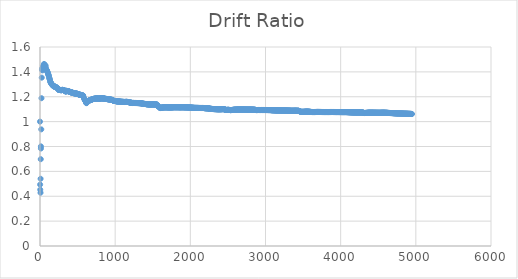
| Category | Drift Ratio |
|---|---|
| 0.0 | 1 |
| 1.70000004768 | 0.494 |
| 3.40000009537 | 0.453 |
| 7.0 | 0.428 |
| 8.0 | 0.541 |
| 10.0 | 0.698 |
| 12.0 | 0.801 |
| 12.5999999046 | 0.784 |
| 17.0 | 0.938 |
| 19.7999999523 | 1.188 |
| 23.4000000954 | 1.353 |
| 26.5999999046 | 1.417 |
| 30.0 | 1.429 |
| 33.0999999046 | 1.412 |
| 36.2999999523 | 1.432 |
| 39.5999999046 | 1.432 |
| 42.4000000954 | 1.444 |
| 45.5999999046 | 1.451 |
| 48.5999999046 | 1.433 |
| 51.5999999046 | 1.428 |
| 54.4000000954 | 1.464 |
| 57.5999999046 | 1.457 |
| 60.5999999046 | 1.454 |
| 64.0 | 1.445 |
| 67.4000000954 | 1.42 |
| 72.0999999046 | 1.454 |
| 75.5999999046 | 1.442 |
| 79.2000000477 | 1.427 |
| 82.4000000954 | 1.422 |
| 85.5999999046 | 1.415 |
| 89.0 | 1.413 |
| 92.2000000477 | 1.412 |
| 95.5999999046 | 1.405 |
| 99.0 | 1.4 |
| 102.0 | 1.396 |
| 105.400000095 | 1.389 |
| 108.799999952 | 1.381 |
| 112.0 | 1.377 |
| 115.599999905 | 1.371 |
| 119.0 | 1.366 |
| 123.099999905 | 1.35 |
| 126.0 | 1.348 |
| 129.200000048 | 1.341 |
| 132.599999905 | 1.334 |
| 135.799999952 | 1.323 |
| 139.0 | 1.319 |
| 142.400000095 | 1.314 |
| 145.799999952 | 1.312 |
| 149.200000048 | 1.307 |
| 153.099999905 | 1.304 |
| 156.200000048 | 1.3 |
| 159.599999905 | 1.298 |
| 163.0 | 1.294 |
| 166.200000048 | 1.294 |
| 169.400000095 | 1.294 |
| 172.799999952 | 1.289 |
| 176.400000095 | 1.286 |
| 180.0 | 1.285 |
| 183.200000048 | 1.284 |
| 186.599999905 | 1.283 |
| 190.0 | 1.282 |
| 193.400000095 | 1.283 |
| 196.799999952 | 1.281 |
| 200.200000048 | 1.281 |
| 203.599999905 | 1.281 |
| 207.200000048 | 1.28 |
| 210.599999905 | 1.278 |
| 214.200000048 | 1.276 |
| 217.599999905 | 1.275 |
| 221.0 | 1.274 |
| 224.400000095 | 1.271 |
| 228.099999905 | 1.271 |
| 231.299999952 | 1.27 |
| 234.799999952 | 1.269 |
| 238.400000095 | 1.266 |
| 242.0 | 1.263 |
| 245.400000095 | 1.256 |
| 249.099999905 | 1.255 |
| 252.299999952 | 1.256 |
| 255.799999952 | 1.255 |
| 259.400000095 | 1.254 |
| 262.799999952 | 1.255 |
| 266.200000048 | 1.255 |
| 269.599999905 | 1.255 |
| 273.099999905 | 1.254 |
| 276.599999905 | 1.253 |
| 280.0 | 1.252 |
| 283.400000095 | 1.252 |
| 286.599999905 | 1.253 |
| 290.0 | 1.254 |
| 293.200000048 | 1.255 |
| 296.400000095 | 1.256 |
| 300.099999905 | 1.256 |
| 303.200000048 | 1.255 |
| 306.400000095 | 1.254 |
| 309.799999952 | 1.254 |
| 313.200000048 | 1.253 |
| 316.599999905 | 1.252 |
| 319.799999952 | 1.251 |
| 323.200000048 | 1.251 |
| 326.400000095 | 1.25 |
| 330.099999905 | 1.25 |
| 333.299999952 | 1.248 |
| 336.799999952 | 1.244 |
| 340.200000048 | 1.243 |
| 343.799999952 | 1.243 |
| 343.799999952 | 1.243 |
| 343.799999952 | 1.243 |
| 349.400000095 | 1.247 |
| 352.599999905 | 1.248 |
| 355.799999952 | 1.247 |
| 358.799999952 | 1.247 |
| 362.200000048 | 1.247 |
| 365.599999905 | 1.246 |
| 369.099999905 | 1.245 |
| 372.599999905 | 1.246 |
| 376.0 | 1.245 |
| 379.400000095 | 1.243 |
| 382.799999952 | 1.242 |
| 386.0 | 1.242 |
| 389.599999905 | 1.241 |
| 393.099999905 | 1.241 |
| 396.200000048 | 1.239 |
| 399.599999905 | 1.239 |
| 403.0 | 1.239 |
| 406.400000095 | 1.237 |
| 407.700000048 | 1.237 |
| 409.0 | 1.236 |
| 410.200000048 | 1.237 |
| 413.599999905 | 1.236 |
| 417.099999905 | 1.234 |
| 420.099999905 | 1.235 |
| 423.299999952 | 1.235 |
| 426.400000095 | 1.234 |
| 429.599999905 | 1.233 |
| 433.0 | 1.232 |
| 436.200000048 | 1.231 |
| 439.400000095 | 1.231 |
| 442.799999952 | 1.23 |
| 446.200000048 | 1.23 |
| 449.599999905 | 1.228 |
| 453.099999905 | 1.228 |
| 456.299999952 | 1.227 |
| 459.599999905 | 1.227 |
| 462.799999952 | 1.227 |
| 466.299999952 | 1.227 |
| 469.400000095 | 1.227 |
| 472.799999952 | 1.227 |
| 476.0 | 1.226 |
| 479.299999952 | 1.226 |
| 482.599999905 | 1.225 |
| 486.099999905 | 1.225 |
| 489.200000048 | 1.224 |
| 492.400000095 | 1.224 |
| 495.799999952 | 1.224 |
| 499.099999905 | 1.223 |
| 502.400000095 | 1.222 |
| 505.700000048 | 1.222 |
| 509.0 | 1.221 |
| 512.5 | 1.22 |
| 515.599999905 | 1.219 |
| 519.099999905 | 1.218 |
| 522.200000048 | 1.217 |
| 525.599999905 | 1.216 |
| 528.799999952 | 1.216 |
| 532.099999905 | 1.216 |
| 535.200000048 | 1.216 |
| 538.5 | 1.216 |
| 541.599999905 | 1.215 |
| 544.900000095 | 1.215 |
| 548.0 | 1.214 |
| 551.5 | 1.214 |
| 554.599999905 | 1.213 |
| 558.099999905 | 1.212 |
| 558.099999905 | 1.212 |
| 558.099999905 | 1.212 |
| 572.599999905 | 1.21 |
| 572.599999905 | 1.21 |
| 572.599999905 | 1.21 |
| 579.200000048 | 1.199 |
| 585.200000048 | 1.189 |
| 589.0 | 1.184 |
| 591.0 | 1.181 |
| 594.400000095 | 1.177 |
| 596.700000048 | 1.174 |
| 600.599999905 | 1.17 |
| 602.599999905 | 1.168 |
| 604.200000048 | 1.166 |
| 611.0 | 1.156 |
| 612.0 | 1.155 |
| 616.650000095 | 1.148 |
| 621.299999952 | 1.151 |
| 623.099999905 | 1.153 |
| 624.900000095 | 1.155 |
| 628.099999905 | 1.157 |
| 631.299999952 | 1.16 |
| 634.900000095 | 1.161 |
| 637.900000095 | 1.163 |
| 641.0 | 1.165 |
| 644.099999905 | 1.166 |
| 647.200000048 | 1.167 |
| 650.299999952 | 1.169 |
| 653.5 | 1.17 |
| 656.700000048 | 1.171 |
| 659.900000095 | 1.171 |
| 663.099999905 | 1.172 |
| 666.099999905 | 1.172 |
| 669.099999905 | 1.173 |
| 672.099999905 | 1.174 |
| 675.299999952 | 1.175 |
| 678.299999952 | 1.176 |
| 681.5 | 1.176 |
| 684.5 | 1.177 |
| 687.700000048 | 1.177 |
| 690.700000048 | 1.178 |
| 693.700000048 | 1.179 |
| 696.900000095 | 1.18 |
| 700.099999905 | 1.181 |
| 703.099999905 | 1.181 |
| 706.299999952 | 1.181 |
| 709.299999952 | 1.182 |
| 712.299999952 | 1.183 |
| 715.299999952 | 1.183 |
| 718.5 | 1.184 |
| 721.299999952 | 1.184 |
| 724.5 | 1.184 |
| 727.5 | 1.184 |
| 730.5 | 1.184 |
| 733.5 | 1.184 |
| 736.5 | 1.185 |
| 739.5 | 1.185 |
| 742.5 | 1.185 |
| 746.0 | 1.186 |
| 749.0 | 1.186 |
| 752.0 | 1.187 |
| 755.0 | 1.186 |
| 758.0 | 1.186 |
| 761.0 | 1.186 |
| 764.0 | 1.186 |
| 767.099999905 | 1.186 |
| 770.099999905 | 1.185 |
| 773.200000048 | 1.185 |
| 776.299999952 | 1.185 |
| 779.5 | 1.185 |
| 782.5 | 1.185 |
| 785.700000048 | 1.185 |
| 788.700000048 | 1.185 |
| 791.700000048 | 1.185 |
| 794.700000048 | 1.185 |
| 797.700000048 | 1.185 |
| 800.5 | 1.185 |
| 803.5 | 1.185 |
| 806.299999952 | 1.186 |
| 809.0 | 1.187 |
| 812.0 | 1.188 |
| 815.0 | 1.188 |
| 818.0 | 1.188 |
| 821.0 | 1.188 |
| 824.099999905 | 1.187 |
| 827.099999905 | 1.187 |
| 830.299999952 | 1.187 |
| 833.299999952 | 1.187 |
| 836.5 | 1.186 |
| 839.5 | 1.186 |
| 842.700000048 | 1.186 |
| 845.900000095 | 1.186 |
| 849.099999905 | 1.186 |
| 852.299999952 | 1.186 |
| 855.299999952 | 1.186 |
| 858.5 | 1.185 |
| 861.700000048 | 1.184 |
| 864.900000095 | 1.184 |
| 868.099999905 | 1.183 |
| 871.299999952 | 1.182 |
| 874.5 | 1.182 |
| 878.0 | 1.183 |
| 881.0 | 1.183 |
| 884.099999905 | 1.182 |
| 887.299999952 | 1.182 |
| 890.5 | 1.182 |
| 893.900000095 | 1.181 |
| 896.900000095 | 1.181 |
| 900.099999905 | 1.18 |
| 903.299999952 | 1.18 |
| 906.5 | 1.18 |
| 909.700000048 | 1.18 |
| 912.700000048 | 1.179 |
| 915.900000095 | 1.179 |
| 919.099999905 | 1.179 |
| 922.299999952 | 1.179 |
| 925.5 | 1.178 |
| 929.0 | 1.178 |
| 932.0 | 1.177 |
| 935.099999905 | 1.177 |
| 938.200000048 | 1.177 |
| 941.299999952 | 1.177 |
| 944.5 | 1.176 |
| 947.700000048 | 1.176 |
| 950.900000095 | 1.176 |
| 954.099999905 | 1.175 |
| 957.299999952 | 1.175 |
| 960.700000048 | 1.175 |
| 963.900000095 | 1.174 |
| 967.299999952 | 1.172 |
| 970.299999952 | 1.17 |
| 973.299999952 | 1.17 |
| 976.5 | 1.168 |
| 980.0 | 1.168 |
| 983.200000048 | 1.167 |
| 986.5 | 1.167 |
| 989.700000048 | 1.167 |
| 992.900000095 | 1.167 |
| 996.099999905 | 1.166 |
| 999.5 | 1.166 |
| 1002.70000005 | 1.166 |
| 1005.9000001 | 1.166 |
| 1009.0999999 | 1.165 |
| 1012.5 | 1.164 |
| 1016.0 | 1.164 |
| 1019.0 | 1.163 |
| 1022.20000005 | 1.163 |
| 1025.5 | 1.163 |
| 1028.70000005 | 1.163 |
| 1031.9000001 | 1.163 |
| 1035.0999999 | 1.163 |
| 1038.29999995 | 1.163 |
| 1041.70000005 | 1.162 |
| 1044.9000001 | 1.162 |
| 1048.0999999 | 1.162 |
| 1051.29999995 | 1.162 |
| 1054.5 | 1.161 |
| 1058.0 | 1.161 |
| 1061.0 | 1.161 |
| 1064.29999995 | 1.161 |
| 1067.5 | 1.161 |
| 1070.70000005 | 1.16 |
| 1073.9000001 | 1.16 |
| 1077.0999999 | 1.16 |
| 1080.29999995 | 1.159 |
| 1083.5 | 1.16 |
| 1086.70000005 | 1.16 |
| 1089.9000001 | 1.159 |
| 1093.0999999 | 1.159 |
| 1096.29999995 | 1.159 |
| 1099.5 | 1.159 |
| 1103.0 | 1.159 |
| 1106.0 | 1.159 |
| 1109.0999999 | 1.159 |
| 1112.29999995 | 1.158 |
| 1115.5999999 | 1.158 |
| 1118.70000005 | 1.158 |
| 1121.9000001 | 1.158 |
| 1125.0999999 | 1.158 |
| 1128.4000001 | 1.158 |
| 1131.5 | 1.158 |
| 1134.79999995 | 1.158 |
| 1137.9000001 | 1.159 |
| 1141.20000005 | 1.159 |
| 1144.5 | 1.159 |
| 1148.0 | 1.159 |
| 1151.0 | 1.159 |
| 1154.0999999 | 1.159 |
| 1157.5 | 1.158 |
| 1160.79999995 | 1.158 |
| 1163.9000001 | 1.158 |
| 1167.20000005 | 1.158 |
| 1170.70000005 | 1.158 |
| 1174.20000005 | 1.157 |
| 1177.29999995 | 1.157 |
| 1181.0 | 1.157 |
| 1184.0 | 1.156 |
| 1187.29999995 | 1.156 |
| 1190.70000005 | 1.155 |
| 1193.9000001 | 1.154 |
| 1197.20000005 | 1.153 |
| 1200.4000001 | 1.152 |
| 1203.5999999 | 1.152 |
| 1206.70000005 | 1.152 |
| 1210.0 | 1.152 |
| 1213.20000005 | 1.152 |
| 1216.4000001 | 1.152 |
| 1219.5999999 | 1.151 |
| 1223.0 | 1.151 |
| 1226.0999999 | 1.15 |
| 1229.4000001 | 1.15 |
| 1232.79999995 | 1.149 |
| 1236.0 | 1.15 |
| 1239.20000005 | 1.15 |
| 1242.5999999 | 1.15 |
| 1245.79999995 | 1.15 |
| 1249.20000005 | 1.15 |
| 1252.5999999 | 1.15 |
| 1256.0 | 1.15 |
| 1259.0 | 1.15 |
| 1262.5999999 | 1.15 |
| 1266.0 | 1.15 |
| 1269.20000005 | 1.15 |
| 1272.5999999 | 1.15 |
| 1276.0 | 1.15 |
| 1279.20000005 | 1.15 |
| 1282.5 | 1.15 |
| 1285.5999999 | 1.15 |
| 1289.0 | 1.149 |
| 1292.4000001 | 1.149 |
| 1295.79999995 | 1.149 |
| 1299.0 | 1.149 |
| 1302.20000005 | 1.149 |
| 1305.4000001 | 1.149 |
| 1308.79999995 | 1.149 |
| 1312.0 | 1.149 |
| 1315.20000005 | 1.149 |
| 1318.4000001 | 1.148 |
| 1321.5999999 | 1.148 |
| 1325.0 | 1.148 |
| 1328.0 | 1.148 |
| 1331.4000001 | 1.148 |
| 1334.5999999 | 1.148 |
| 1337.79999995 | 1.148 |
| 1341.0 | 1.148 |
| 1344.4000001 | 1.147 |
| 1347.5999999 | 1.147 |
| 1350.79999995 | 1.147 |
| 1353.79999995 | 1.147 |
| 1357.20000005 | 1.146 |
| 1360.4000001 | 1.146 |
| 1364.0 | 1.144 |
| 1367.0 | 1.144 |
| 1370.0 | 1.144 |
| 1373.0999999 | 1.144 |
| 1376.4000001 | 1.144 |
| 1379.4000001 | 1.143 |
| 1382.5999999 | 1.143 |
| 1386.0 | 1.143 |
| 1389.20000005 | 1.142 |
| 1392.5999999 | 1.142 |
| 1395.5999999 | 1.142 |
| 1399.0 | 1.142 |
| 1402.20000005 | 1.142 |
| 1405.5999999 | 1.142 |
| 1409.0 | 1.141 |
| 1412.0999999 | 1.14 |
| 1415.5999999 | 1.14 |
| 1419.0 | 1.14 |
| 1422.20000005 | 1.14 |
| 1425.79999995 | 1.139 |
| 1429.0 | 1.139 |
| 1432.4000001 | 1.139 |
| 1435.5999999 | 1.139 |
| 1439.0 | 1.139 |
| 1442.4000001 | 1.139 |
| 1445.5999999 | 1.138 |
| 1448.79999995 | 1.138 |
| 1452.0 | 1.138 |
| 1455.4000001 | 1.138 |
| 1458.5999999 | 1.138 |
| 1461.79999995 | 1.138 |
| 1465.0 | 1.138 |
| 1468.4000001 | 1.138 |
| 1472.0 | 1.138 |
| 1475.0 | 1.138 |
| 1478.5999999 | 1.138 |
| 1481.79999995 | 1.138 |
| 1485.0 | 1.138 |
| 1488.4000001 | 1.139 |
| 1491.5999999 | 1.139 |
| 1494.79999995 | 1.139 |
| 1498.0 | 1.138 |
| 1501.20000005 | 1.138 |
| 1504.4000001 | 1.138 |
| 1508.0 | 1.138 |
| 1511.0 | 1.138 |
| 1514.20000005 | 1.138 |
| 1517.5999999 | 1.138 |
| 1520.79999995 | 1.138 |
| 1524.0 | 1.138 |
| 1527.4000001 | 1.138 |
| 1530.5999999 | 1.138 |
| 1533.79999995 | 1.137 |
| 1537.0 | 1.137 |
| 1540.20000005 | 1.137 |
| 1543.5999999 | 1.137 |
| 1547.0 | 1.137 |
| 1550.0 | 1.137 |
| 1553.0999999 | 1.137 |
| 1553.0999999 | 1.137 |
| 1553.0999999 | 1.137 |
| 1563.29999995 | 1.129 |
| 1564.5 | 1.128 |
| 1565.70000005 | 1.127 |
| 1566.70000005 | 1.127 |
| 1569.5 | 1.125 |
| 1572.5 | 1.123 |
| 1576.0999999 | 1.121 |
| 1589.5 | 1.114 |
| 1594.3499999 | 1.111 |
| 1599.20000005 | 1.109 |
| 1600.20000005 | 1.109 |
| 1604.0 | 1.11 |
| 1607.5999999 | 1.11 |
| 1611.0 | 1.111 |
| 1614.4000001 | 1.112 |
| 1617.79999995 | 1.112 |
| 1621.0 | 1.112 |
| 1624.4000001 | 1.113 |
| 1627.9000001 | 1.114 |
| 1631.0 | 1.114 |
| 1634.20000005 | 1.114 |
| 1637.5999999 | 1.114 |
| 1640.79999995 | 1.114 |
| 1644.0 | 1.115 |
| 1647.20000005 | 1.115 |
| 1650.4000001 | 1.115 |
| 1653.79999995 | 1.115 |
| 1656.79999995 | 1.115 |
| 1660.20000005 | 1.115 |
| 1663.4000001 | 1.115 |
| 1666.4000001 | 1.115 |
| 1669.9000001 | 1.115 |
| 1672.9000001 | 1.115 |
| 1675.9000001 | 1.115 |
| 1679.0999999 | 1.115 |
| 1682.20000005 | 1.115 |
| 1685.4000001 | 1.115 |
| 1688.5999999 | 1.115 |
| 1692.0 | 1.115 |
| 1695.0 | 1.115 |
| 1698.4000001 | 1.115 |
| 1701.5999999 | 1.115 |
| 1705.0 | 1.114 |
| 1708.0 | 1.114 |
| 1711.4000001 | 1.114 |
| 1714.9000001 | 1.114 |
| 1717.9000001 | 1.114 |
| 1721.0999999 | 1.114 |
| 1724.20000005 | 1.114 |
| 1727.4000001 | 1.114 |
| 1730.5999999 | 1.115 |
| 1733.79999995 | 1.114 |
| 1737.0 | 1.114 |
| 1740.4000001 | 1.114 |
| 1743.5999999 | 1.114 |
| 1746.79999995 | 1.114 |
| 1750.0 | 1.114 |
| 1753.20000005 | 1.114 |
| 1756.4000001 | 1.115 |
| 1759.9000001 | 1.115 |
| 1762.9000001 | 1.115 |
| 1766.0 | 1.115 |
| 1769.0999999 | 1.115 |
| 1772.4000001 | 1.115 |
| 1775.5999999 | 1.116 |
| 1778.5999999 | 1.116 |
| 1781.79999995 | 1.116 |
| 1785.20000005 | 1.116 |
| 1788.4000001 | 1.116 |
| 1791.5999999 | 1.116 |
| 1794.79999995 | 1.116 |
| 1798.0 | 1.116 |
| 1801.20000005 | 1.116 |
| 1804.9000001 | 1.116 |
| 1807.9000001 | 1.116 |
| 1811.0999999 | 1.116 |
| 1814.20000005 | 1.115 |
| 1817.20000005 | 1.116 |
| 1820.5999999 | 1.116 |
| 1823.5999999 | 1.116 |
| 1826.79999995 | 1.116 |
| 1830.0 | 1.116 |
| 1833.20000005 | 1.115 |
| 1836.4000001 | 1.115 |
| 1839.5999999 | 1.116 |
| 1842.79999995 | 1.116 |
| 1846.0 | 1.116 |
| 1849.29999995 | 1.115 |
| 1852.4000001 | 1.115 |
| 1855.9000001 | 1.115 |
| 1858.9000001 | 1.115 |
| 1861.9000001 | 1.115 |
| 1865.0999999 | 1.115 |
| 1868.29999995 | 1.115 |
| 1871.20000005 | 1.115 |
| 1874.5 | 1.115 |
| 1877.5999999 | 1.115 |
| 1880.5999999 | 1.115 |
| 1883.79999995 | 1.115 |
| 1887.0 | 1.116 |
| 1890.0 | 1.116 |
| 1893.20000005 | 1.116 |
| 1896.4000001 | 1.115 |
| 1899.5999999 | 1.116 |
| 1902.79999995 | 1.116 |
| 1906.0 | 1.115 |
| 1909.0 | 1.115 |
| 1912.20000005 | 1.115 |
| 1915.4000001 | 1.115 |
| 1918.9000001 | 1.115 |
| 1921.9000001 | 1.115 |
| 1925.0 | 1.115 |
| 1928.20000005 | 1.115 |
| 1931.4000001 | 1.115 |
| 1934.5999999 | 1.115 |
| 1937.79999995 | 1.115 |
| 1941.20000005 | 1.115 |
| 1944.4000001 | 1.115 |
| 1947.70000005 | 1.115 |
| 1950.79999995 | 1.115 |
| 1954.0999999 | 1.115 |
| 1957.20000005 | 1.115 |
| 1960.4000001 | 1.114 |
| 1963.9000001 | 1.114 |
| 1966.9000001 | 1.114 |
| 1970.0999999 | 1.114 |
| 1973.29999995 | 1.114 |
| 1976.5999999 | 1.114 |
| 1979.70000005 | 1.114 |
| 1983.0 | 1.114 |
| 1986.29999995 | 1.114 |
| 1989.5 | 1.114 |
| 1992.70000005 | 1.113 |
| 1996.0 | 1.113 |
| 1999.29999995 | 1.113 |
| 2002.4000001 | 1.113 |
| 2005.9000001 | 1.113 |
| 2008.9000001 | 1.112 |
| 2011.9000001 | 1.112 |
| 2015.0999999 | 1.112 |
| 2018.5 | 1.112 |
| 2021.9000001 | 1.112 |
| 2025.0999999 | 1.112 |
| 2028.29999995 | 1.112 |
| 2031.70000005 | 1.112 |
| 2034.70000005 | 1.112 |
| 2038.0999999 | 1.111 |
| 2041.5 | 1.111 |
| 2044.9000001 | 1.111 |
| 2047.9000001 | 1.111 |
| 2051.29999995 | 1.111 |
| 2054.5 | 1.111 |
| 2057.70000005 | 1.111 |
| 2060.9000001 | 1.111 |
| 2064.29999995 | 1.111 |
| 2067.5 | 1.111 |
| 2070.70000005 | 1.111 |
| 2073.9000001 | 1.111 |
| 2077.0999999 | 1.111 |
| 2080.29999995 | 1.111 |
| 2083.5 | 1.111 |
| 2086.9000001 | 1.11 |
| 2090.0 | 1.11 |
| 2093.29999995 | 1.11 |
| 2096.5 | 1.11 |
| 2099.70000005 | 1.11 |
| 2102.9000001 | 1.11 |
| 2106.0999999 | 1.11 |
| 2109.29999995 | 1.11 |
| 2112.70000005 | 1.11 |
| 2115.9000001 | 1.11 |
| 2119.29999995 | 1.11 |
| 2122.5 | 1.11 |
| 2125.9000001 | 1.11 |
| 2128.9000001 | 1.11 |
| 2132.0 | 1.11 |
| 2135.29999995 | 1.11 |
| 2138.70000005 | 1.11 |
| 2141.9000001 | 1.11 |
| 2145.0999999 | 1.11 |
| 2148.29999995 | 1.11 |
| 2151.5 | 1.11 |
| 2154.70000005 | 1.11 |
| 2157.70000005 | 1.11 |
| 2160.9000001 | 1.11 |
| 2164.29999995 | 1.11 |
| 2167.5 | 1.11 |
| 2170.9000001 | 1.11 |
| 2173.9000001 | 1.11 |
| 2177.0 | 1.109 |
| 2180.0999999 | 1.109 |
| 2183.5 | 1.109 |
| 2186.70000005 | 1.108 |
| 2190.0999999 | 1.108 |
| 2193.29999995 | 1.108 |
| 2196.5 | 1.108 |
| 2199.70000005 | 1.108 |
| 2202.9000001 | 1.108 |
| 2206.0999999 | 1.108 |
| 2209.29999995 | 1.108 |
| 2212.5 | 1.107 |
| 2215.9000001 | 1.107 |
| 2218.9000001 | 1.107 |
| 2222.0 | 1.107 |
| 2225.29999995 | 1.107 |
| 2228.29999995 | 1.107 |
| 2231.5 | 1.107 |
| 2234.9000001 | 1.107 |
| 2238.0999999 | 1.106 |
| 2241.29999995 | 1.106 |
| 2244.70000005 | 1.106 |
| 2247.9000001 | 1.106 |
| 2251.29999995 | 1.104 |
| 2251.29999995 | 1.104 |
| 2251.29999995 | 1.104 |
| 2257.29999995 | 1.104 |
| 2260.5 | 1.104 |
| 2263.5 | 1.104 |
| 2266.9000001 | 1.103 |
| 2269.9000001 | 1.103 |
| 2273.29999995 | 1.103 |
| 2276.5 | 1.103 |
| 2279.70000005 | 1.103 |
| 2283.0999999 | 1.102 |
| 2286.5 | 1.102 |
| 2289.70000005 | 1.102 |
| 2292.9000001 | 1.102 |
| 2296.0999999 | 1.102 |
| 2299.29999995 | 1.101 |
| 2302.9000001 | 1.101 |
| 2305.9000001 | 1.101 |
| 2309.0999999 | 1.101 |
| 2312.5 | 1.101 |
| 2315.70000005 | 1.101 |
| 2318.9000001 | 1.101 |
| 2322.0999999 | 1.1 |
| 2325.5 | 1.1 |
| 2328.70000005 | 1.1 |
| 2332.0999999 | 1.1 |
| 2335.5 | 1.1 |
| 2338.9000001 | 1.1 |
| 2341.9000001 | 1.1 |
| 2345.0999999 | 1.1 |
| 2348.29999995 | 1.1 |
| 2351.70000005 | 1.1 |
| 2354.9000001 | 1.1 |
| 2358.0999999 | 1.1 |
| 2361.5 | 1.099 |
| 2364.70000005 | 1.099 |
| 2367.9000001 | 1.099 |
| 2371.0999999 | 1.099 |
| 2374.29999995 | 1.099 |
| 2377.5 | 1.099 |
| 2380.9000001 | 1.099 |
| 2384.0999999 | 1.099 |
| 2387.5 | 1.099 |
| 2390.70000005 | 1.099 |
| 2393.70000005 | 1.099 |
| 2396.9000001 | 1.1 |
| 2399.9000001 | 1.1 |
| 2402.9000001 | 1.1 |
| 2405.9000001 | 1.1 |
| 2409.0999999 | 1.1 |
| 2412.29999995 | 1.1 |
| 2415.29999995 | 1.1 |
| 2418.5 | 1.1 |
| 2421.5 | 1.1 |
| 2424.70000005 | 1.1 |
| 2427.70000005 | 1.1 |
| 2430.9000001 | 1.1 |
| 2433.9000001 | 1.1 |
| 2437.0999999 | 1.1 |
| 2440.29999995 | 1.1 |
| 2443.5 | 1.1 |
| 2446.9000001 | 1.1 |
| 2452.04999995 | 1.1 |
| 2457.20000005 | 1.098 |
| 2458.70000005 | 1.097 |
| 2460.3499999 | 1.097 |
| 2462.0 | 1.096 |
| 2464.4000001 | 1.096 |
| 2467.4000001 | 1.095 |
| 2469.5999999 | 1.094 |
| 2480.4000001 | 1.094 |
| 2482.20000005 | 1.094 |
| 2484.0 | 1.094 |
| 2487.4000001 | 1.095 |
| 2490.5999999 | 1.094 |
| 2493.79999995 | 1.095 |
| 2497.0 | 1.095 |
| 2500.20000005 | 1.095 |
| 2503.9000001 | 1.095 |
| 2506.79999995 | 1.095 |
| 2510.0999999 | 1.095 |
| 2513.4000001 | 1.094 |
| 2516.5999999 | 1.094 |
| 2523.70000005 | 1.094 |
| 2530.79999995 | 1.093 |
| 2534.0 | 1.092 |
| 2537.20000005 | 1.092 |
| 2540.5999999 | 1.093 |
| 2543.79999995 | 1.093 |
| 2547.0 | 1.093 |
| 2550.20000005 | 1.093 |
| 2553.4000001 | 1.094 |
| 2556.4000001 | 1.094 |
| 2559.79999995 | 1.094 |
| 2563.0 | 1.094 |
| 2566.0 | 1.094 |
| 2569.4000001 | 1.095 |
| 2572.79999995 | 1.095 |
| 2575.79999995 | 1.095 |
| 2578.79999995 | 1.095 |
| 2581.79999995 | 1.096 |
| 2584.9000001 | 1.096 |
| 2588.20000005 | 1.096 |
| 2591.4000001 | 1.096 |
| 2594.4000001 | 1.096 |
| 2597.5999999 | 1.096 |
| 2600.5999999 | 1.096 |
| 2603.5999999 | 1.096 |
| 2606.79999995 | 1.096 |
| 2610.0 | 1.096 |
| 2613.0 | 1.096 |
| 2616.20000005 | 1.096 |
| 2619.20000005 | 1.096 |
| 2622.4000001 | 1.097 |
| 2625.5999999 | 1.097 |
| 2628.5999999 | 1.097 |
| 2631.5999999 | 1.097 |
| 2634.5999999 | 1.097 |
| 2637.79999995 | 1.097 |
| 2640.79999995 | 1.097 |
| 2644.0 | 1.097 |
| 2647.0 | 1.097 |
| 2650.0 | 1.097 |
| 2653.20000005 | 1.097 |
| 2656.20000005 | 1.097 |
| 2659.20000005 | 1.097 |
| 2662.20000005 | 1.097 |
| 2665.4000001 | 1.097 |
| 2668.79999995 | 1.097 |
| 2671.79999995 | 1.097 |
| 2674.79999995 | 1.097 |
| 2677.79999995 | 1.097 |
| 2681.0999999 | 1.097 |
| 2684.4000001 | 1.097 |
| 2687.5999999 | 1.097 |
| 2690.79999995 | 1.097 |
| 2693.79999995 | 1.097 |
| 2697.0 | 1.097 |
| 2700.20000005 | 1.097 |
| 2703.5999999 | 1.097 |
| 2706.5999999 | 1.097 |
| 2709.79999995 | 1.097 |
| 2713.0 | 1.097 |
| 2716.20000005 | 1.097 |
| 2719.4000001 | 1.097 |
| 2722.9000001 | 1.097 |
| 2725.9000001 | 1.097 |
| 2728.9000001 | 1.097 |
| 2732.20000005 | 1.097 |
| 2735.4000001 | 1.097 |
| 2738.5999999 | 1.097 |
| 2742.0 | 1.097 |
| 2745.20000005 | 1.097 |
| 2748.20000005 | 1.097 |
| 2751.4000001 | 1.097 |
| 2754.5999999 | 1.097 |
| 2757.79999995 | 1.097 |
| 2761.0 | 1.097 |
| 2764.20000005 | 1.096 |
| 2767.20000005 | 1.097 |
| 2770.4000001 | 1.097 |
| 2773.9000001 | 1.097 |
| 2776.9000001 | 1.097 |
| 2780.0999999 | 1.097 |
| 2783.20000005 | 1.097 |
| 2786.4000001 | 1.097 |
| 2789.5999999 | 1.097 |
| 2792.5999999 | 1.097 |
| 2795.79999995 | 1.097 |
| 2799.0 | 1.097 |
| 2802.20000005 | 1.097 |
| 2805.4000001 | 1.097 |
| 2808.5999999 | 1.097 |
| 2811.79999995 | 1.097 |
| 2815.0 | 1.096 |
| 2818.20000005 | 1.096 |
| 2821.4000001 | 1.096 |
| 2824.4000001 | 1.096 |
| 2827.9000001 | 1.096 |
| 2830.9000001 | 1.096 |
| 2834.0999999 | 1.096 |
| 2837.20000005 | 1.096 |
| 2840.20000005 | 1.096 |
| 2843.4000001 | 1.096 |
| 2846.5999999 | 1.096 |
| 2849.79999995 | 1.096 |
| 2853.0 | 1.095 |
| 2856.20000005 | 1.095 |
| 2859.4000001 | 1.095 |
| 2862.5999999 | 1.095 |
| 2865.79999995 | 1.094 |
| 2869.0 | 1.094 |
| 2872.0 | 1.093 |
| 2875.0 | 1.093 |
| 2878.0 | 1.093 |
| 2881.20000005 | 1.093 |
| 2884.4000001 | 1.093 |
| 2887.9000001 | 1.093 |
| 2890.9000001 | 1.093 |
| 2894.20000005 | 1.093 |
| 2897.4000001 | 1.093 |
| 2900.4000001 | 1.093 |
| 2903.5999999 | 1.093 |
| 2907.0 | 1.094 |
| 2910.20000005 | 1.094 |
| 2913.4000001 | 1.093 |
| 2916.79999995 | 1.093 |
| 2920.0 | 1.093 |
| 2923.20000005 | 1.093 |
| 2926.4000001 | 1.093 |
| 2929.9000001 | 1.093 |
| 2932.9000001 | 1.093 |
| 2936.20000005 | 1.093 |
| 2939.5999999 | 1.093 |
| 2942.79999995 | 1.093 |
| 2946.0 | 1.093 |
| 2949.20000005 | 1.093 |
| 2952.4000001 | 1.093 |
| 2955.5999999 | 1.093 |
| 2958.79999995 | 1.093 |
| 2962.0 | 1.093 |
| 2965.20000005 | 1.093 |
| 2968.20000005 | 1.093 |
| 2971.4000001 | 1.093 |
| 2974.9000001 | 1.093 |
| 2977.9000001 | 1.093 |
| 2980.9000001 | 1.093 |
| 2984.0 | 1.093 |
| 2987.0999999 | 1.093 |
| 2990.4000001 | 1.093 |
| 2993.5999999 | 1.093 |
| 2996.79999995 | 1.093 |
| 2999.79999995 | 1.093 |
| 3003.0 | 1.093 |
| 3006.20000005 | 1.093 |
| 3009.4000001 | 1.093 |
| 3012.5999999 | 1.093 |
| 3015.79999995 | 1.093 |
| 3019.0 | 1.093 |
| 3022.0 | 1.093 |
| 3025.20000005 | 1.093 |
| 3028.4000001 | 1.093 |
| 3031.9000001 | 1.093 |
| 3034.9000001 | 1.093 |
| 3038.0 | 1.093 |
| 3041.20000005 | 1.093 |
| 3044.5999999 | 1.093 |
| 3047.79999995 | 1.093 |
| 3051.0 | 1.093 |
| 3054.20000005 | 1.093 |
| 3057.4000001 | 1.093 |
| 3060.5 | 1.093 |
| 3063.5999999 | 1.092 |
| 3066.79999995 | 1.092 |
| 3070.0 | 1.092 |
| 3073.29999995 | 1.092 |
| 3076.4000001 | 1.092 |
| 3079.9000001 | 1.092 |
| 3083.0 | 1.092 |
| 3086.29999995 | 1.091 |
| 3089.4000001 | 1.091 |
| 3092.5 | 1.091 |
| 3095.79999995 | 1.091 |
| 3099.0999999 | 1.091 |
| 3102.4000001 | 1.091 |
| 3105.9000001 | 1.091 |
| 3109.0 | 1.091 |
| 3112.29999995 | 1.091 |
| 3115.9000001 | 1.091 |
| 3118.9000001 | 1.091 |
| 3122.0 | 1.091 |
| 3125.5 | 1.091 |
| 3128.5999999 | 1.091 |
| 3131.70000005 | 1.091 |
| 3134.79999995 | 1.091 |
| 3137.9000001 | 1.09 |
| 3141.0 | 1.09 |
| 3144.20000005 | 1.09 |
| 3147.5 | 1.09 |
| 3150.70000005 | 1.09 |
| 3153.5999999 | 1.09 |
| 3156.79999995 | 1.09 |
| 3159.9000001 | 1.09 |
| 3163.0 | 1.09 |
| 3166.0999999 | 1.09 |
| 3169.20000005 | 1.09 |
| 3172.4000001 | 1.09 |
| 3175.9000001 | 1.09 |
| 3178.9000001 | 1.09 |
| 3181.9000001 | 1.09 |
| 3185.0 | 1.09 |
| 3188.0999999 | 1.09 |
| 3191.20000005 | 1.09 |
| 3194.4000001 | 1.09 |
| 3197.70000005 | 1.09 |
| 3200.9000001 | 1.089 |
| 3203.9000001 | 1.09 |
| 3207.0999999 | 1.089 |
| 3210.0999999 | 1.089 |
| 3213.0999999 | 1.089 |
| 3216.29999995 | 1.089 |
| 3219.5 | 1.089 |
| 3222.70000005 | 1.089 |
| 3225.9000001 | 1.089 |
| 3229.0999999 | 1.089 |
| 3232.29999995 | 1.089 |
| 3235.5 | 1.089 |
| 3238.9000001 | 1.089 |
| 3241.9000001 | 1.089 |
| 3244.9000001 | 1.089 |
| 3247.9000001 | 1.089 |
| 3251.0999999 | 1.089 |
| 3254.0999999 | 1.089 |
| 3257.29999995 | 1.089 |
| 3260.29999995 | 1.089 |
| 3263.29999995 | 1.089 |
| 3266.5 | 1.089 |
| 3269.29999995 | 1.089 |
| 3272.29999995 | 1.089 |
| 3275.0 | 1.089 |
| 3278.0 | 1.089 |
| 3281.0 | 1.089 |
| 3283.9000001 | 1.089 |
| 3286.9000001 | 1.089 |
| 3289.9000001 | 1.088 |
| 3292.9000001 | 1.088 |
| 3295.9000001 | 1.088 |
| 3298.9000001 | 1.088 |
| 3301.9000001 | 1.088 |
| 3304.9000001 | 1.088 |
| 3307.5 | 1.088 |
| 3310.5 | 1.088 |
| 3313.9000001 | 1.088 |
| 3316.9000001 | 1.088 |
| 3319.9000001 | 1.088 |
| 3322.9000001 | 1.088 |
| 3326.0999999 | 1.088 |
| 3329.29999995 | 1.088 |
| 3332.29999995 | 1.088 |
| 3335.29999995 | 1.088 |
| 3338.5 | 1.087 |
| 3341.70000005 | 1.087 |
| 3344.9000001 | 1.087 |
| 3348.0999999 | 1.087 |
| 3351.29999995 | 1.087 |
| 3354.5 | 1.087 |
| 3357.5 | 1.087 |
| 3360.70000005 | 1.088 |
| 3363.70000005 | 1.088 |
| 3366.9000001 | 1.088 |
| 3369.9000001 | 1.088 |
| 3372.9000001 | 1.088 |
| 3376.0999999 | 1.088 |
| 3379.29999995 | 1.088 |
| 3382.5 | 1.088 |
| 3385.5 | 1.088 |
| 3388.9000001 | 1.088 |
| 3391.9000001 | 1.088 |
| 3394.9000001 | 1.088 |
| 3398.0 | 1.088 |
| 3401.0 | 1.088 |
| 3404.0999999 | 1.088 |
| 3407.29999995 | 1.088 |
| 3410.5 | 1.088 |
| 3413.70000005 | 1.088 |
| 3416.9000001 | 1.087 |
| 3419.9000001 | 1.087 |
| 3423.0999999 | 1.087 |
| 3426.29999995 | 1.087 |
| 3429.5 | 1.087 |
| 3432.5 | 1.087 |
| 3435.70000005 | 1.087 |
| 3438.9000001 | 1.087 |
| 3442.0999999 | 1.087 |
| 3442.0999999 | 1.087 |
| 3442.0999999 | 1.087 |
| 3453.9000001 | 1.083 |
| 3455.29999995 | 1.083 |
| 3456.70000005 | 1.082 |
| 3460.29999995 | 1.082 |
| 3464.0 | 1.081 |
| 3467.5 | 1.08 |
| 3470.9000001 | 1.08 |
| 3480.70000005 | 1.079 |
| 3485.54999995 | 1.079 |
| 3490.4000001 | 1.078 |
| 3491.0 | 1.078 |
| 3494.5999999 | 1.079 |
| 3498.0 | 1.079 |
| 3501.4000001 | 1.079 |
| 3504.79999995 | 1.079 |
| 3508.4000001 | 1.079 |
| 3512.0 | 1.079 |
| 3515.20000005 | 1.079 |
| 3518.5999999 | 1.079 |
| 3521.79999995 | 1.079 |
| 3525.0 | 1.08 |
| 3528.4000001 | 1.08 |
| 3531.79999995 | 1.08 |
| 3534.9000001 | 1.08 |
| 3538.0999999 | 1.08 |
| 3541.4000001 | 1.08 |
| 3544.5999999 | 1.08 |
| 3547.79999995 | 1.08 |
| 3551.20000005 | 1.08 |
| 3554.4000001 | 1.08 |
| 3557.5999999 | 1.08 |
| 3560.79999995 | 1.08 |
| 3563.79999995 | 1.08 |
| 3567.20000005 | 1.08 |
| 3570.0 | 1.08 |
| 3573.4000001 | 1.08 |
| 3576.20000005 | 1.08 |
| 3579.4000001 | 1.08 |
| 3582.79999995 | 1.079 |
| 3586.20000005 | 1.079 |
| 3589.5999999 | 1.079 |
| 3592.79999995 | 1.079 |
| 3595.79999995 | 1.079 |
| 3599.0 | 1.078 |
| 3602.79999995 | 1.078 |
| 3605.79999995 | 1.078 |
| 3608.5999999 | 1.078 |
| 3611.5999999 | 1.078 |
| 3614.79999995 | 1.077 |
| 3618.0 | 1.077 |
| 3621.20000005 | 1.077 |
| 3624.20000005 | 1.077 |
| 3627.4000001 | 1.077 |
| 3630.9000001 | 1.077 |
| 3634.0 | 1.077 |
| 3637.0999999 | 1.077 |
| 3640.4000001 | 1.077 |
| 3643.5999999 | 1.077 |
| 3647.0 | 1.077 |
| 3650.20000005 | 1.077 |
| 3653.4000001 | 1.077 |
| 3656.79999995 | 1.077 |
| 3660.20000005 | 1.077 |
| 3663.9000001 | 1.077 |
| 3666.9000001 | 1.077 |
| 3670.0999999 | 1.077 |
| 3673.20000005 | 1.078 |
| 3676.5999999 | 1.078 |
| 3679.79999995 | 1.078 |
| 3683.0 | 1.078 |
| 3686.20000005 | 1.078 |
| 3689.4000001 | 1.078 |
| 3692.5999999 | 1.078 |
| 3696.0 | 1.078 |
| 3699.20000005 | 1.078 |
| 3702.4000001 | 1.078 |
| 3705.9000001 | 1.078 |
| 3708.9000001 | 1.078 |
| 3712.20000005 | 1.078 |
| 3715.5999999 | 1.078 |
| 3718.79999995 | 1.078 |
| 3722.20000005 | 1.078 |
| 3725.5999999 | 1.078 |
| 3728.79999995 | 1.078 |
| 3732.20000005 | 1.078 |
| 3735.4000001 | 1.078 |
| 3738.9000001 | 1.077 |
| 3742.0999999 | 1.077 |
| 3745.4000001 | 1.077 |
| 3748.79999995 | 1.077 |
| 3752.0 | 1.077 |
| 3755.20000005 | 1.077 |
| 3758.4000001 | 1.077 |
| 3761.79999995 | 1.077 |
| 3765.0 | 1.077 |
| 3768.20000005 | 1.077 |
| 3771.4000001 | 1.077 |
| 3774.9000001 | 1.077 |
| 3778.0 | 1.077 |
| 3781.20000005 | 1.077 |
| 3784.5999999 | 1.077 |
| 3787.5999999 | 1.077 |
| 3791.0 | 1.077 |
| 3794.20000005 | 1.077 |
| 3797.4000001 | 1.077 |
| 3800.79999995 | 1.077 |
| 3804.0 | 1.077 |
| 3807.4000001 | 1.077 |
| 3810.9000001 | 1.077 |
| 3814.0 | 1.077 |
| 3817.20000005 | 1.077 |
| 3820.5999999 | 1.077 |
| 3823.79999995 | 1.077 |
| 3827.0 | 1.077 |
| 3830.4000001 | 1.077 |
| 3833.5999999 | 1.077 |
| 3836.79999995 | 1.077 |
| 3840.20000005 | 1.077 |
| 3843.4000001 | 1.077 |
| 3846.9000001 | 1.077 |
| 3849.9000001 | 1.077 |
| 3852.9000001 | 1.077 |
| 3856.0999999 | 1.077 |
| 3859.4000001 | 1.077 |
| 3862.5999999 | 1.077 |
| 3865.79999995 | 1.077 |
| 3869.20000005 | 1.077 |
| 3872.29999995 | 1.077 |
| 3875.4000001 | 1.077 |
| 3878.70000005 | 1.077 |
| 3881.79999995 | 1.077 |
| 3885.0999999 | 1.077 |
| 3888.20000005 | 1.077 |
| 3891.29999995 | 1.077 |
| 3894.4000001 | 1.077 |
| 3897.9000001 | 1.077 |
| 3900.9000001 | 1.077 |
| 3904.0 | 1.077 |
| 3907.20000005 | 1.077 |
| 3910.4000001 | 1.077 |
| 3913.5999999 | 1.077 |
| 3916.79999995 | 1.077 |
| 3920.20000005 | 1.077 |
| 3923.4000001 | 1.077 |
| 3926.70000005 | 1.077 |
| 3930.0999999 | 1.077 |
| 3933.29999995 | 1.077 |
| 3936.29999995 | 1.077 |
| 3939.5 | 1.077 |
| 3942.9000001 | 1.077 |
| 3946.0999999 | 1.077 |
| 3949.5 | 1.077 |
| 3952.5999999 | 1.077 |
| 3956.0999999 | 1.077 |
| 3959.20000005 | 1.077 |
| 3962.4000001 | 1.077 |
| 3965.70000005 | 1.077 |
| 3969.0999999 | 1.077 |
| 3972.29999995 | 1.077 |
| 3975.5 | 1.077 |
| 3978.9000001 | 1.077 |
| 3982.0 | 1.077 |
| 3985.29999995 | 1.077 |
| 3988.5 | 1.077 |
| 3991.70000005 | 1.077 |
| 3994.9000001 | 1.077 |
| 3998.29999995 | 1.077 |
| 4001.4000001 | 1.077 |
| 4004.70000005 | 1.077 |
| 4008.0999999 | 1.076 |
| 4011.29999995 | 1.076 |
| 4014.9000001 | 1.077 |
| 4017.9000001 | 1.076 |
| 4020.9000001 | 1.076 |
| 4024.0999999 | 1.076 |
| 4027.5 | 1.076 |
| 4030.70000005 | 1.076 |
| 4033.9000001 | 1.076 |
| 4037.0999999 | 1.076 |
| 4040.29999995 | 1.076 |
| 4043.5 | 1.076 |
| 4046.70000005 | 1.076 |
| 4049.9000001 | 1.076 |
| 4052.9000001 | 1.076 |
| 4056.0999999 | 1.076 |
| 4059.29999995 | 1.077 |
| 4062.5 | 1.076 |
| 4065.9000001 | 1.077 |
| 4068.9000001 | 1.076 |
| 4071.9000001 | 1.076 |
| 4075.29999995 | 1.076 |
| 4078.5 | 1.076 |
| 4081.70000005 | 1.076 |
| 4084.9000001 | 1.076 |
| 4088.0999999 | 1.076 |
| 4091.5 | 1.076 |
| 4094.70000005 | 1.076 |
| 4097.9000001 | 1.076 |
| 4101.0999999 | 1.076 |
| 4104.29999995 | 1.076 |
| 4107.5 | 1.076 |
| 4110.9000001 | 1.076 |
| 4113.9000001 | 1.075 |
| 4117.0 | 1.075 |
| 4120.29999995 | 1.075 |
| 4123.5 | 1.075 |
| 4126.70000005 | 1.075 |
| 4129.9000001 | 1.075 |
| 4133.29999995 | 1.075 |
| 4136.29999995 | 1.075 |
| 4139.70000005 | 1.075 |
| 4142.9000001 | 1.075 |
| 4146.29999995 | 1.075 |
| 4149.5 | 1.075 |
| 4152.9000001 | 1.075 |
| 4156.0 | 1.074 |
| 4159.0999999 | 1.074 |
| 4162.5 | 1.074 |
| 4165.70000005 | 1.074 |
| 4169.0999999 | 1.074 |
| 4172.29999995 | 1.074 |
| 4175.70000005 | 1.074 |
| 4179.0999999 | 1.074 |
| 4182.29999995 | 1.074 |
| 4185.5 | 1.074 |
| 4188.9000001 | 1.074 |
| 4191.9000001 | 1.074 |
| 4195.29999995 | 1.074 |
| 4198.5 | 1.074 |
| 4201.9000001 | 1.074 |
| 4205.0999999 | 1.074 |
| 4208.29999995 | 1.074 |
| 4211.5 | 1.074 |
| 4214.70000005 | 1.074 |
| 4217.9000001 | 1.074 |
| 4221.0999999 | 1.074 |
| 4224.5 | 1.074 |
| 4227.9000001 | 1.074 |
| 4230.9000001 | 1.074 |
| 4234.0999999 | 1.074 |
| 4237.29999995 | 1.074 |
| 4240.5 | 1.074 |
| 4243.70000005 | 1.074 |
| 4246.9000001 | 1.074 |
| 4250.0999999 | 1.074 |
| 4253.29999995 | 1.074 |
| 4256.5 | 1.074 |
| 4259.9000001 | 1.074 |
| 4263.0999999 | 1.074 |
| 4266.29999995 | 1.074 |
| 4269.29999995 | 1.074 |
| 4272.5 | 1.074 |
| 4275.9000001 | 1.074 |
| 4278.9000001 | 1.074 |
| 4281.9000001 | 1.073 |
| 4285.0999999 | 1.073 |
| 4288.5 | 1.073 |
| 4291.70000005 | 1.073 |
| 4295.5 | 1.073 |
| 4299.9000001 | 1.072 |
| 4303.4000001 | 1.071 |
| 4306.9000001 | 1.071 |
| 4312.1500001 | 1.069 |
| 4317.4000001 | 1.069 |
| 4318.5 | 1.069 |
| 4321.79999995 | 1.07 |
| 4325.29999995 | 1.07 |
| 4328.4000001 | 1.07 |
| 4331.9000001 | 1.07 |
| 4334.9000001 | 1.07 |
| 4337.9000001 | 1.07 |
| 4341.0999999 | 1.07 |
| 4344.5 | 1.071 |
| 4347.5999999 | 1.071 |
| 4350.9000001 | 1.071 |
| 4354.29999995 | 1.071 |
| 4357.5 | 1.071 |
| 4360.5999999 | 1.071 |
| 4364.0999999 | 1.072 |
| 4367.20000005 | 1.072 |
| 4370.4000001 | 1.072 |
| 4373.9000001 | 1.072 |
| 4376.9000001 | 1.072 |
| 4379.9000001 | 1.072 |
| 4383.0999999 | 1.072 |
| 4386.20000005 | 1.072 |
| 4389.4000001 | 1.072 |
| 4392.70000005 | 1.072 |
| 4395.79999995 | 1.072 |
| 4399.29999995 | 1.072 |
| 4402.4000001 | 1.072 |
| 4405.5999999 | 1.072 |
| 4408.9000001 | 1.072 |
| 4412.0 | 1.072 |
| 4415.29999995 | 1.072 |
| 4418.5 | 1.072 |
| 4421.9000001 | 1.072 |
| 4424.9000001 | 1.072 |
| 4427.9000001 | 1.072 |
| 4431.0 | 1.072 |
| 4434.0 | 1.072 |
| 4437.20000005 | 1.072 |
| 4440.4000001 | 1.072 |
| 4443.70000005 | 1.072 |
| 4447.0999999 | 1.072 |
| 4450.29999995 | 1.072 |
| 4453.29999995 | 1.072 |
| 4456.4000001 | 1.071 |
| 4459.70000005 | 1.071 |
| 4462.70000005 | 1.071 |
| 4465.9000001 | 1.071 |
| 4469.0999999 | 1.071 |
| 4472.29999995 | 1.071 |
| 4475.5 | 1.071 |
| 4478.9000001 | 1.071 |
| 4481.9000001 | 1.071 |
| 4484.9000001 | 1.071 |
| 4488.0999999 | 1.071 |
| 4491.5 | 1.071 |
| 4494.70000005 | 1.071 |
| 4497.70000005 | 1.071 |
| 4500.70000005 | 1.071 |
| 4503.9000001 | 1.071 |
| 4506.9000001 | 1.071 |
| 4510.0999999 | 1.071 |
| 4513.29999995 | 1.071 |
| 4516.5 | 1.071 |
| 4519.70000005 | 1.071 |
| 4522.70000005 | 1.071 |
| 4525.70000005 | 1.071 |
| 4528.9000001 | 1.071 |
| 4532.0999999 | 1.071 |
| 4535.29999995 | 1.071 |
| 4538.0999999 | 1.071 |
| 4541.29999995 | 1.071 |
| 4544.5 | 1.072 |
| 4547.5 | 1.071 |
| 4550.9000001 | 1.072 |
| 4553.9000001 | 1.072 |
| 4556.9000001 | 1.071 |
| 4560.0999999 | 1.071 |
| 4562.70000005 | 1.072 |
| 4565.29999995 | 1.072 |
| 4568.5 | 1.072 |
| 4571.5 | 1.072 |
| 4574.9000001 | 1.072 |
| 4577.9000001 | 1.072 |
| 4581.0 | 1.072 |
| 4584.29999995 | 1.071 |
| 4587.5 | 1.071 |
| 4590.5 | 1.071 |
| 4593.70000005 | 1.071 |
| 4596.9000001 | 1.071 |
| 4600.29999995 | 1.071 |
| 4603.5 | 1.071 |
| 4606.70000005 | 1.071 |
| 4610.0999999 | 1.071 |
| 4613.5 | 1.071 |
| 4616.9000001 | 1.071 |
| 4620.0999999 | 1.071 |
| 4623.5 | 1.07 |
| 4626.70000005 | 1.07 |
| 4629.9000001 | 1.07 |
| 4633.0999999 | 1.07 |
| 4636.5 | 1.07 |
| 4639.5 | 1.07 |
| 4642.70000005 | 1.07 |
| 4646.0999999 | 1.07 |
| 4649.5 | 1.07 |
| 4653.5 | 1.069 |
| 4657.70000005 | 1.069 |
| 4661.9000001 | 1.069 |
| 4665.9000001 | 1.069 |
| 4670.29999995 | 1.069 |
| 4674.70000005 | 1.069 |
| 4678.9000001 | 1.068 |
| 4683.0 | 1.068 |
| 4687.29999995 | 1.068 |
| 4691.29999995 | 1.068 |
| 4695.5 | 1.068 |
| 4699.9000001 | 1.068 |
| 4704.0999999 | 1.068 |
| 4708.5 | 1.067 |
| 4712.29999995 | 1.067 |
| 4715.9000001 | 1.067 |
| 4719.9000001 | 1.067 |
| 4723.70000005 | 1.067 |
| 4727.5 | 1.067 |
| 4731.0999999 | 1.067 |
| 4735.0999999 | 1.067 |
| 4738.70000005 | 1.067 |
| 4742.9000001 | 1.066 |
| 4746.5 | 1.066 |
| 4750.29999995 | 1.066 |
| 4753.9000001 | 1.066 |
| 4757.9000001 | 1.066 |
| 4761.70000005 | 1.066 |
| 4765.29999995 | 1.066 |
| 4769.0999999 | 1.066 |
| 4773.29999995 | 1.066 |
| 4777.70000005 | 1.066 |
| 4781.9000001 | 1.066 |
| 4785.9000001 | 1.066 |
| 4789.9000001 | 1.065 |
| 4793.9000001 | 1.065 |
| 4797.70000005 | 1.065 |
| 4801.70000005 | 1.065 |
| 4806.0 | 1.065 |
| 4809.5 | 1.065 |
| 4813.29999995 | 1.065 |
| 4817.0999999 | 1.065 |
| 4820.9000001 | 1.065 |
| 4824.5 | 1.065 |
| 4828.0999999 | 1.064 |
| 4831.9000001 | 1.064 |
| 4835.5 | 1.064 |
| 4839.5 | 1.064 |
| 4843.5 | 1.064 |
| 4847.29999995 | 1.064 |
| 4851.20000005 | 1.064 |
| 4855.0999999 | 1.064 |
| 4859.29999995 | 1.064 |
| 4863.5 | 1.064 |
| 4867.5 | 1.064 |
| 4871.29999995 | 1.064 |
| 4875.0 | 1.064 |
| 4878.9000001 | 1.064 |
| 4882.70000005 | 1.063 |
| 4886.29999995 | 1.063 |
| 4890.0999999 | 1.063 |
| 4893.9000001 | 1.063 |
| 4897.5 | 1.063 |
| 4901.29999995 | 1.063 |
| 4904.9000001 | 1.063 |
| 4908.9000001 | 1.063 |
| 4912.5 | 1.063 |
| 4916.29999995 | 1.063 |
| 4920.0 | 1.063 |
| 4923.9000001 | 1.063 |
| 4927.70000005 | 1.063 |
| 4931.5 | 1.062 |
| 4934.9000001 | 1.062 |
| 4938.70000005 | 1.062 |
| 4942.29999995 | 1.062 |
| 4946.29999995 | 1.061 |
| 4946.29999995 | 1.061 |